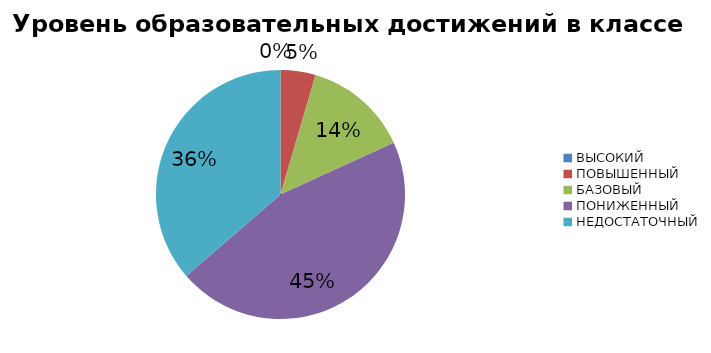
| Category | Series 0 |
|---|---|
| ВЫСОКИЙ | 0 |
| ПОВЫШЕННЫЙ | 4.545 |
| БАЗОВЫЙ | 13.636 |
| ПОНИЖЕННЫЙ | 45.455 |
| НЕДОСТАТОЧНЫЙ | 36.364 |